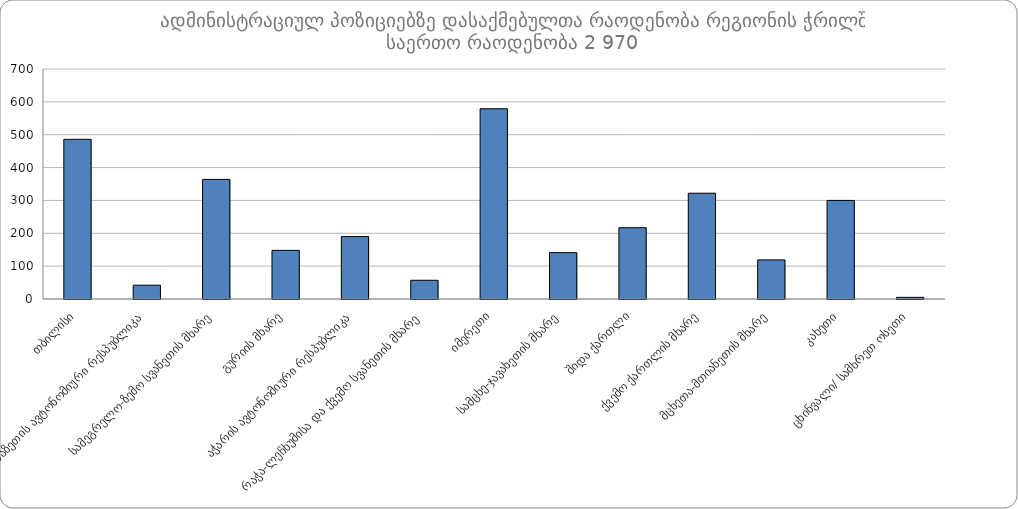
| Category | ჯამი |
|---|---|
|  თბილისი | 486 |
|  აფხაზეთის ავტონომიური რესპუბლიკა | 42 |
|  სამეგრელო-ზემო სვანეთის მხარე | 364 |
|  გურიის მხარე | 148 |
|  აჭარის ავტონომიური რესპუბლიკა | 190 |
|  რაჭა-ლეჩხუმისა და ქვემო სვანეთის მხარე | 57 |
|  იმერეთი | 579 |
|  სამცხე-ჯავახეთის მხარე | 141 |
|  შიდა ქართლი | 217 |
|  ქვემო ქართლის მხარე | 322 |
|  მცხეთა-მთიანეთის მხარე | 119 |
|  კახეთი | 300 |
|  ცხინვალი/ სამხრეთ ოსეთი | 5 |